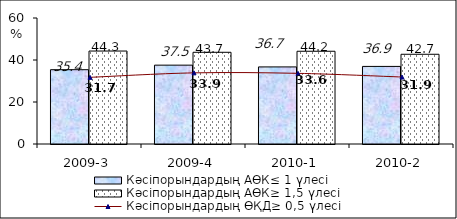
| Category | Кәсіпорындардың АӨК≤ 1 үлесі | Кәсіпорындардың АӨК≥ 1,5 үлесі |
|---|---|---|
| 2009-3 | 35.38 | 44.27 |
| 2009-4 | 37.55 | 43.675 |
| 2010-1 | 36.708 | 44.162 |
| 2010-2 | 36.944 | 42.73 |